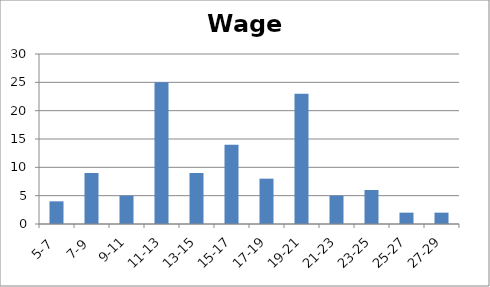
| Category | Series 0 |
|---|---|
| 5-7 | 4 |
| 7-9 | 9 |
| 9-11 | 5 |
| 11-13 | 25 |
| 13-15 | 9 |
| 15-17 | 14 |
| 17-19 | 8 |
| 19-21 | 23 |
| 21-23 | 5 |
| 23-25 | 6 |
| 25-27 | 2 |
| 27-29 | 2 |